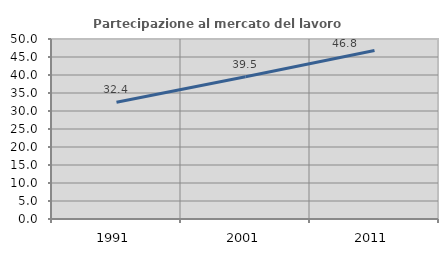
| Category | Partecipazione al mercato del lavoro  femminile |
|---|---|
| 1991.0 | 32.409 |
| 2001.0 | 39.524 |
| 2011.0 | 46.798 |